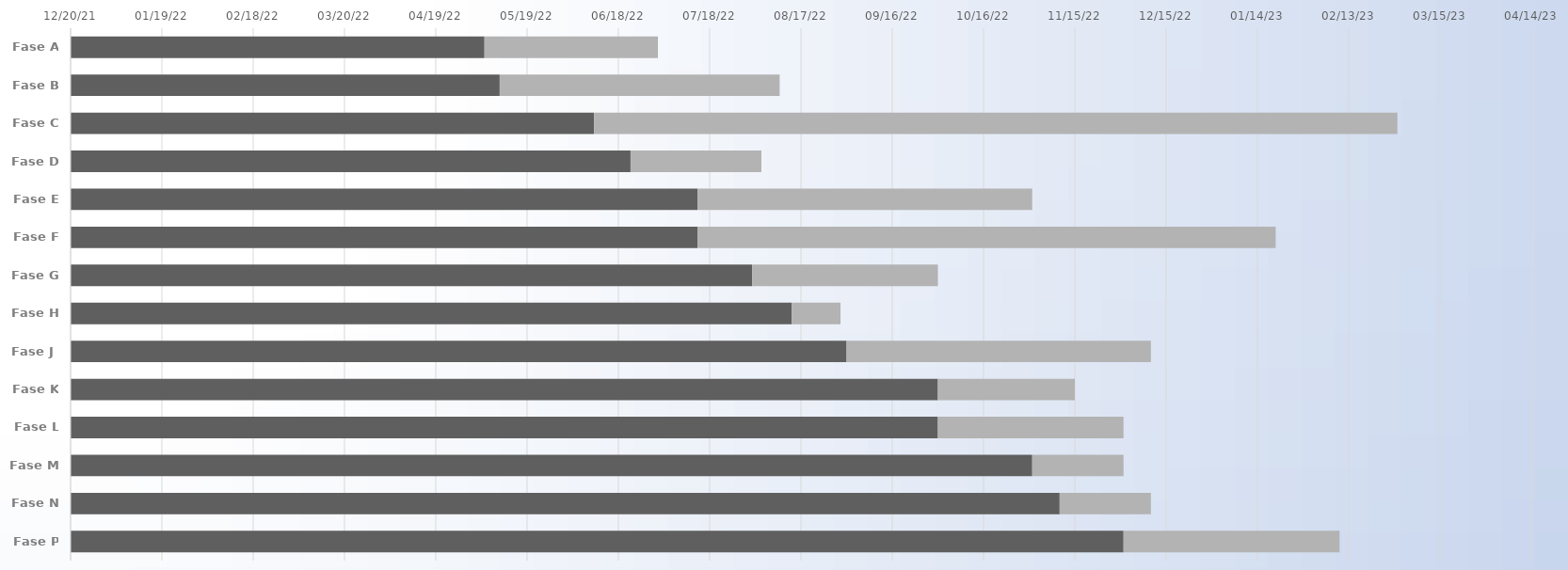
| Category | COMENZAR | Duración |
|---|---|---|
| Fase A | 2022-05-05 | 57 |
| Fase B | 2022-05-10 | 92 |
| Fase C | 2022-06-10 | 264 |
| Fase D | 2022-06-22 | 43 |
| Fase E | 2022-07-14 | 110 |
| Fase F | 2022-07-14 | 190 |
| Fase G | 2022-08-01 | 61 |
| Fase H | 2022-08-14 | 16 |
| Fase J | 2022-09-01 | 100 |
| Fase K | 2022-10-01 | 45 |
| Fase L | 2022-10-01 | 61 |
| Fase M | 2022-11-01 | 30 |
| Fase N | 2022-11-10 | 30 |
| Fase P | 2022-12-01 | 71 |